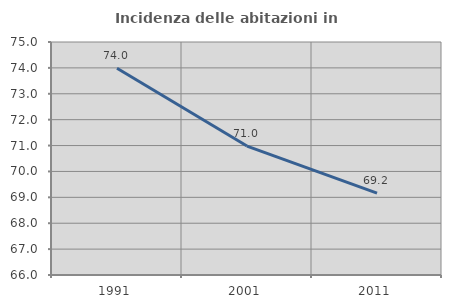
| Category | Incidenza delle abitazioni in proprietà  |
|---|---|
| 1991.0 | 73.987 |
| 2001.0 | 70.98 |
| 2011.0 | 69.164 |